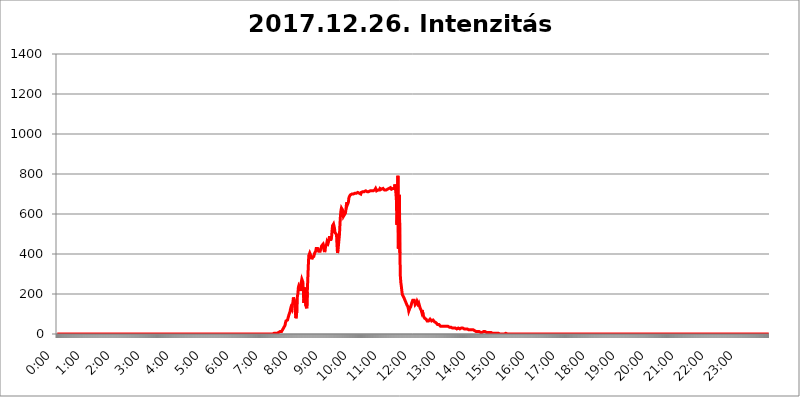
| Category | 2017.12.26. Intenzitás [W/m^2] |
|---|---|
| 0.0 | 0 |
| 0.0006944444444444445 | 0 |
| 0.001388888888888889 | 0 |
| 0.0020833333333333333 | 0 |
| 0.002777777777777778 | 0 |
| 0.003472222222222222 | 0 |
| 0.004166666666666667 | 0 |
| 0.004861111111111111 | 0 |
| 0.005555555555555556 | 0 |
| 0.0062499999999999995 | 0 |
| 0.006944444444444444 | 0 |
| 0.007638888888888889 | 0 |
| 0.008333333333333333 | 0 |
| 0.009027777777777779 | 0 |
| 0.009722222222222222 | 0 |
| 0.010416666666666666 | 0 |
| 0.011111111111111112 | 0 |
| 0.011805555555555555 | 0 |
| 0.012499999999999999 | 0 |
| 0.013194444444444444 | 0 |
| 0.013888888888888888 | 0 |
| 0.014583333333333332 | 0 |
| 0.015277777777777777 | 0 |
| 0.015972222222222224 | 0 |
| 0.016666666666666666 | 0 |
| 0.017361111111111112 | 0 |
| 0.018055555555555557 | 0 |
| 0.01875 | 0 |
| 0.019444444444444445 | 0 |
| 0.02013888888888889 | 0 |
| 0.020833333333333332 | 0 |
| 0.02152777777777778 | 0 |
| 0.022222222222222223 | 0 |
| 0.02291666666666667 | 0 |
| 0.02361111111111111 | 0 |
| 0.024305555555555556 | 0 |
| 0.024999999999999998 | 0 |
| 0.025694444444444447 | 0 |
| 0.02638888888888889 | 0 |
| 0.027083333333333334 | 0 |
| 0.027777777777777776 | 0 |
| 0.02847222222222222 | 0 |
| 0.029166666666666664 | 0 |
| 0.029861111111111113 | 0 |
| 0.030555555555555555 | 0 |
| 0.03125 | 0 |
| 0.03194444444444445 | 0 |
| 0.03263888888888889 | 0 |
| 0.03333333333333333 | 0 |
| 0.034027777777777775 | 0 |
| 0.034722222222222224 | 0 |
| 0.035416666666666666 | 0 |
| 0.036111111111111115 | 0 |
| 0.03680555555555556 | 0 |
| 0.0375 | 0 |
| 0.03819444444444444 | 0 |
| 0.03888888888888889 | 0 |
| 0.03958333333333333 | 0 |
| 0.04027777777777778 | 0 |
| 0.04097222222222222 | 0 |
| 0.041666666666666664 | 0 |
| 0.042361111111111106 | 0 |
| 0.04305555555555556 | 0 |
| 0.043750000000000004 | 0 |
| 0.044444444444444446 | 0 |
| 0.04513888888888889 | 0 |
| 0.04583333333333334 | 0 |
| 0.04652777777777778 | 0 |
| 0.04722222222222222 | 0 |
| 0.04791666666666666 | 0 |
| 0.04861111111111111 | 0 |
| 0.049305555555555554 | 0 |
| 0.049999999999999996 | 0 |
| 0.05069444444444445 | 0 |
| 0.051388888888888894 | 0 |
| 0.052083333333333336 | 0 |
| 0.05277777777777778 | 0 |
| 0.05347222222222222 | 0 |
| 0.05416666666666667 | 0 |
| 0.05486111111111111 | 0 |
| 0.05555555555555555 | 0 |
| 0.05625 | 0 |
| 0.05694444444444444 | 0 |
| 0.057638888888888885 | 0 |
| 0.05833333333333333 | 0 |
| 0.05902777777777778 | 0 |
| 0.059722222222222225 | 0 |
| 0.06041666666666667 | 0 |
| 0.061111111111111116 | 0 |
| 0.06180555555555556 | 0 |
| 0.0625 | 0 |
| 0.06319444444444444 | 0 |
| 0.06388888888888888 | 0 |
| 0.06458333333333334 | 0 |
| 0.06527777777777778 | 0 |
| 0.06597222222222222 | 0 |
| 0.06666666666666667 | 0 |
| 0.06736111111111111 | 0 |
| 0.06805555555555555 | 0 |
| 0.06874999999999999 | 0 |
| 0.06944444444444443 | 0 |
| 0.07013888888888889 | 0 |
| 0.07083333333333333 | 0 |
| 0.07152777777777779 | 0 |
| 0.07222222222222223 | 0 |
| 0.07291666666666667 | 0 |
| 0.07361111111111111 | 0 |
| 0.07430555555555556 | 0 |
| 0.075 | 0 |
| 0.07569444444444444 | 0 |
| 0.0763888888888889 | 0 |
| 0.07708333333333334 | 0 |
| 0.07777777777777778 | 0 |
| 0.07847222222222222 | 0 |
| 0.07916666666666666 | 0 |
| 0.0798611111111111 | 0 |
| 0.08055555555555556 | 0 |
| 0.08125 | 0 |
| 0.08194444444444444 | 0 |
| 0.08263888888888889 | 0 |
| 0.08333333333333333 | 0 |
| 0.08402777777777777 | 0 |
| 0.08472222222222221 | 0 |
| 0.08541666666666665 | 0 |
| 0.08611111111111112 | 0 |
| 0.08680555555555557 | 0 |
| 0.08750000000000001 | 0 |
| 0.08819444444444445 | 0 |
| 0.08888888888888889 | 0 |
| 0.08958333333333333 | 0 |
| 0.09027777777777778 | 0 |
| 0.09097222222222222 | 0 |
| 0.09166666666666667 | 0 |
| 0.09236111111111112 | 0 |
| 0.09305555555555556 | 0 |
| 0.09375 | 0 |
| 0.09444444444444444 | 0 |
| 0.09513888888888888 | 0 |
| 0.09583333333333333 | 0 |
| 0.09652777777777777 | 0 |
| 0.09722222222222222 | 0 |
| 0.09791666666666667 | 0 |
| 0.09861111111111111 | 0 |
| 0.09930555555555555 | 0 |
| 0.09999999999999999 | 0 |
| 0.10069444444444443 | 0 |
| 0.1013888888888889 | 0 |
| 0.10208333333333335 | 0 |
| 0.10277777777777779 | 0 |
| 0.10347222222222223 | 0 |
| 0.10416666666666667 | 0 |
| 0.10486111111111111 | 0 |
| 0.10555555555555556 | 0 |
| 0.10625 | 0 |
| 0.10694444444444444 | 0 |
| 0.1076388888888889 | 0 |
| 0.10833333333333334 | 0 |
| 0.10902777777777778 | 0 |
| 0.10972222222222222 | 0 |
| 0.1111111111111111 | 0 |
| 0.11180555555555556 | 0 |
| 0.11180555555555556 | 0 |
| 0.1125 | 0 |
| 0.11319444444444444 | 0 |
| 0.11388888888888889 | 0 |
| 0.11458333333333333 | 0 |
| 0.11527777777777777 | 0 |
| 0.11597222222222221 | 0 |
| 0.11666666666666665 | 0 |
| 0.1173611111111111 | 0 |
| 0.11805555555555557 | 0 |
| 0.11944444444444445 | 0 |
| 0.12013888888888889 | 0 |
| 0.12083333333333333 | 0 |
| 0.12152777777777778 | 0 |
| 0.12222222222222223 | 0 |
| 0.12291666666666667 | 0 |
| 0.12291666666666667 | 0 |
| 0.12361111111111112 | 0 |
| 0.12430555555555556 | 0 |
| 0.125 | 0 |
| 0.12569444444444444 | 0 |
| 0.12638888888888888 | 0 |
| 0.12708333333333333 | 0 |
| 0.16875 | 0 |
| 0.12847222222222224 | 0 |
| 0.12916666666666668 | 0 |
| 0.12986111111111112 | 0 |
| 0.13055555555555556 | 0 |
| 0.13125 | 0 |
| 0.13194444444444445 | 0 |
| 0.1326388888888889 | 0 |
| 0.13333333333333333 | 0 |
| 0.13402777777777777 | 0 |
| 0.13402777777777777 | 0 |
| 0.13472222222222222 | 0 |
| 0.13541666666666666 | 0 |
| 0.1361111111111111 | 0 |
| 0.13749999999999998 | 0 |
| 0.13819444444444443 | 0 |
| 0.1388888888888889 | 0 |
| 0.13958333333333334 | 0 |
| 0.14027777777777778 | 0 |
| 0.14097222222222222 | 0 |
| 0.14166666666666666 | 0 |
| 0.1423611111111111 | 0 |
| 0.14305555555555557 | 0 |
| 0.14375000000000002 | 0 |
| 0.14444444444444446 | 0 |
| 0.1451388888888889 | 0 |
| 0.1451388888888889 | 0 |
| 0.14652777777777778 | 0 |
| 0.14722222222222223 | 0 |
| 0.14791666666666667 | 0 |
| 0.1486111111111111 | 0 |
| 0.14930555555555555 | 0 |
| 0.15 | 0 |
| 0.15069444444444444 | 0 |
| 0.15138888888888888 | 0 |
| 0.15208333333333332 | 0 |
| 0.15277777777777776 | 0 |
| 0.15347222222222223 | 0 |
| 0.15416666666666667 | 0 |
| 0.15486111111111112 | 0 |
| 0.15555555555555556 | 0 |
| 0.15625 | 0 |
| 0.15694444444444444 | 0 |
| 0.15763888888888888 | 0 |
| 0.15833333333333333 | 0 |
| 0.15902777777777777 | 0 |
| 0.15972222222222224 | 0 |
| 0.16041666666666668 | 0 |
| 0.16111111111111112 | 0 |
| 0.16180555555555556 | 0 |
| 0.1625 | 0 |
| 0.16319444444444445 | 0 |
| 0.1638888888888889 | 0 |
| 0.16458333333333333 | 0 |
| 0.16527777777777777 | 0 |
| 0.16597222222222222 | 0 |
| 0.16666666666666666 | 0 |
| 0.1673611111111111 | 0 |
| 0.16805555555555554 | 0 |
| 0.16874999999999998 | 0 |
| 0.16944444444444443 | 0 |
| 0.17013888888888887 | 0 |
| 0.1708333333333333 | 0 |
| 0.17152777777777775 | 0 |
| 0.17222222222222225 | 0 |
| 0.1729166666666667 | 0 |
| 0.17361111111111113 | 0 |
| 0.17430555555555557 | 0 |
| 0.17500000000000002 | 0 |
| 0.17569444444444446 | 0 |
| 0.1763888888888889 | 0 |
| 0.17708333333333334 | 0 |
| 0.17777777777777778 | 0 |
| 0.17847222222222223 | 0 |
| 0.17916666666666667 | 0 |
| 0.1798611111111111 | 0 |
| 0.18055555555555555 | 0 |
| 0.18125 | 0 |
| 0.18194444444444444 | 0 |
| 0.1826388888888889 | 0 |
| 0.18333333333333335 | 0 |
| 0.1840277777777778 | 0 |
| 0.18472222222222223 | 0 |
| 0.18541666666666667 | 0 |
| 0.18611111111111112 | 0 |
| 0.18680555555555556 | 0 |
| 0.1875 | 0 |
| 0.18819444444444444 | 0 |
| 0.18888888888888888 | 0 |
| 0.18958333333333333 | 0 |
| 0.19027777777777777 | 0 |
| 0.1909722222222222 | 0 |
| 0.19166666666666665 | 0 |
| 0.19236111111111112 | 0 |
| 0.19305555555555554 | 0 |
| 0.19375 | 0 |
| 0.19444444444444445 | 0 |
| 0.1951388888888889 | 0 |
| 0.19583333333333333 | 0 |
| 0.19652777777777777 | 0 |
| 0.19722222222222222 | 0 |
| 0.19791666666666666 | 0 |
| 0.1986111111111111 | 0 |
| 0.19930555555555554 | 0 |
| 0.19999999999999998 | 0 |
| 0.20069444444444443 | 0 |
| 0.20138888888888887 | 0 |
| 0.2020833333333333 | 0 |
| 0.2027777777777778 | 0 |
| 0.2034722222222222 | 0 |
| 0.2041666666666667 | 0 |
| 0.20486111111111113 | 0 |
| 0.20555555555555557 | 0 |
| 0.20625000000000002 | 0 |
| 0.20694444444444446 | 0 |
| 0.2076388888888889 | 0 |
| 0.20833333333333334 | 0 |
| 0.20902777777777778 | 0 |
| 0.20972222222222223 | 0 |
| 0.21041666666666667 | 0 |
| 0.2111111111111111 | 0 |
| 0.21180555555555555 | 0 |
| 0.2125 | 0 |
| 0.21319444444444444 | 0 |
| 0.2138888888888889 | 0 |
| 0.21458333333333335 | 0 |
| 0.2152777777777778 | 0 |
| 0.21597222222222223 | 0 |
| 0.21666666666666667 | 0 |
| 0.21736111111111112 | 0 |
| 0.21805555555555556 | 0 |
| 0.21875 | 0 |
| 0.21944444444444444 | 0 |
| 0.22013888888888888 | 0 |
| 0.22083333333333333 | 0 |
| 0.22152777777777777 | 0 |
| 0.2222222222222222 | 0 |
| 0.22291666666666665 | 0 |
| 0.2236111111111111 | 0 |
| 0.22430555555555556 | 0 |
| 0.225 | 0 |
| 0.22569444444444445 | 0 |
| 0.2263888888888889 | 0 |
| 0.22708333333333333 | 0 |
| 0.22777777777777777 | 0 |
| 0.22847222222222222 | 0 |
| 0.22916666666666666 | 0 |
| 0.2298611111111111 | 0 |
| 0.23055555555555554 | 0 |
| 0.23124999999999998 | 0 |
| 0.23194444444444443 | 0 |
| 0.23263888888888887 | 0 |
| 0.2333333333333333 | 0 |
| 0.2340277777777778 | 0 |
| 0.2347222222222222 | 0 |
| 0.2354166666666667 | 0 |
| 0.23611111111111113 | 0 |
| 0.23680555555555557 | 0 |
| 0.23750000000000002 | 0 |
| 0.23819444444444446 | 0 |
| 0.2388888888888889 | 0 |
| 0.23958333333333334 | 0 |
| 0.24027777777777778 | 0 |
| 0.24097222222222223 | 0 |
| 0.24166666666666667 | 0 |
| 0.2423611111111111 | 0 |
| 0.24305555555555555 | 0 |
| 0.24375 | 0 |
| 0.24444444444444446 | 0 |
| 0.24513888888888888 | 0 |
| 0.24583333333333335 | 0 |
| 0.2465277777777778 | 0 |
| 0.24722222222222223 | 0 |
| 0.24791666666666667 | 0 |
| 0.24861111111111112 | 0 |
| 0.24930555555555556 | 0 |
| 0.25 | 0 |
| 0.25069444444444444 | 0 |
| 0.2513888888888889 | 0 |
| 0.2520833333333333 | 0 |
| 0.25277777777777777 | 0 |
| 0.2534722222222222 | 0 |
| 0.25416666666666665 | 0 |
| 0.2548611111111111 | 0 |
| 0.2555555555555556 | 0 |
| 0.25625000000000003 | 0 |
| 0.2569444444444445 | 0 |
| 0.2576388888888889 | 0 |
| 0.25833333333333336 | 0 |
| 0.2590277777777778 | 0 |
| 0.25972222222222224 | 0 |
| 0.2604166666666667 | 0 |
| 0.2611111111111111 | 0 |
| 0.26180555555555557 | 0 |
| 0.2625 | 0 |
| 0.26319444444444445 | 0 |
| 0.2638888888888889 | 0 |
| 0.26458333333333334 | 0 |
| 0.2652777777777778 | 0 |
| 0.2659722222222222 | 0 |
| 0.26666666666666666 | 0 |
| 0.2673611111111111 | 0 |
| 0.26805555555555555 | 0 |
| 0.26875 | 0 |
| 0.26944444444444443 | 0 |
| 0.2701388888888889 | 0 |
| 0.2708333333333333 | 0 |
| 0.27152777777777776 | 0 |
| 0.2722222222222222 | 0 |
| 0.27291666666666664 | 0 |
| 0.2736111111111111 | 0 |
| 0.2743055555555555 | 0 |
| 0.27499999999999997 | 0 |
| 0.27569444444444446 | 0 |
| 0.27638888888888885 | 0 |
| 0.27708333333333335 | 0 |
| 0.2777777777777778 | 0 |
| 0.27847222222222223 | 0 |
| 0.2791666666666667 | 0 |
| 0.2798611111111111 | 0 |
| 0.28055555555555556 | 0 |
| 0.28125 | 0 |
| 0.28194444444444444 | 0 |
| 0.2826388888888889 | 0 |
| 0.2833333333333333 | 0 |
| 0.28402777777777777 | 0 |
| 0.2847222222222222 | 0 |
| 0.28541666666666665 | 0 |
| 0.28611111111111115 | 0 |
| 0.28680555555555554 | 0 |
| 0.28750000000000003 | 0 |
| 0.2881944444444445 | 0 |
| 0.2888888888888889 | 0 |
| 0.28958333333333336 | 0 |
| 0.2902777777777778 | 0 |
| 0.29097222222222224 | 0 |
| 0.2916666666666667 | 0 |
| 0.2923611111111111 | 0 |
| 0.29305555555555557 | 0 |
| 0.29375 | 0 |
| 0.29444444444444445 | 0 |
| 0.2951388888888889 | 0 |
| 0.29583333333333334 | 0 |
| 0.2965277777777778 | 0 |
| 0.2972222222222222 | 0 |
| 0.29791666666666666 | 0 |
| 0.2986111111111111 | 0 |
| 0.29930555555555555 | 0 |
| 0.3 | 0 |
| 0.30069444444444443 | 0 |
| 0.3013888888888889 | 0 |
| 0.3020833333333333 | 0 |
| 0.30277777777777776 | 0 |
| 0.3034722222222222 | 0 |
| 0.30416666666666664 | 3.525 |
| 0.3048611111111111 | 3.525 |
| 0.3055555555555555 | 3.525 |
| 0.30624999999999997 | 3.525 |
| 0.3069444444444444 | 3.525 |
| 0.3076388888888889 | 3.525 |
| 0.30833333333333335 | 3.525 |
| 0.3090277777777778 | 3.525 |
| 0.30972222222222223 | 7.887 |
| 0.3104166666666667 | 7.887 |
| 0.3111111111111111 | 7.887 |
| 0.31180555555555556 | 7.887 |
| 0.3125 | 12.257 |
| 0.31319444444444444 | 12.257 |
| 0.3138888888888889 | 12.257 |
| 0.3145833333333333 | 12.257 |
| 0.31527777777777777 | 12.257 |
| 0.3159722222222222 | 16.636 |
| 0.31666666666666665 | 25.419 |
| 0.31736111111111115 | 29.823 |
| 0.31805555555555554 | 34.234 |
| 0.31875000000000003 | 38.653 |
| 0.3194444444444445 | 43.079 |
| 0.3201388888888889 | 56.398 |
| 0.32083333333333336 | 65.31 |
| 0.3215277777777778 | 65.31 |
| 0.32222222222222224 | 60.85 |
| 0.3229166666666667 | 69.775 |
| 0.3236111111111111 | 78.722 |
| 0.32430555555555557 | 78.722 |
| 0.325 | 96.682 |
| 0.32569444444444445 | 101.184 |
| 0.3263888888888889 | 110.201 |
| 0.32708333333333334 | 123.758 |
| 0.3277777777777778 | 132.814 |
| 0.3284722222222222 | 137.347 |
| 0.32916666666666666 | 123.758 |
| 0.3298611111111111 | 146.423 |
| 0.33055555555555555 | 160.056 |
| 0.33125 | 182.82 |
| 0.33194444444444443 | 187.378 |
| 0.3326388888888889 | 178.264 |
| 0.3333333333333333 | 155.509 |
| 0.3340277777777778 | 105.69 |
| 0.3347222222222222 | 78.722 |
| 0.3354166666666667 | 83.205 |
| 0.3361111111111111 | 114.716 |
| 0.3368055555555556 | 187.378 |
| 0.33749999999999997 | 201.058 |
| 0.33819444444444446 | 233 |
| 0.33888888888888885 | 242.127 |
| 0.33958333333333335 | 242.127 |
| 0.34027777777777773 | 237.564 |
| 0.34097222222222223 | 228.436 |
| 0.3416666666666666 | 214.746 |
| 0.3423611111111111 | 260.373 |
| 0.3430555555555555 | 274.047 |
| 0.34375 | 278.603 |
| 0.3444444444444445 | 260.373 |
| 0.3451388888888889 | 219.309 |
| 0.3458333333333334 | 155.509 |
| 0.34652777777777777 | 187.378 |
| 0.34722222222222227 | 196.497 |
| 0.34791666666666665 | 233 |
| 0.34861111111111115 | 141.884 |
| 0.34930555555555554 | 137.347 |
| 0.35000000000000003 | 128.284 |
| 0.3506944444444444 | 210.182 |
| 0.3513888888888889 | 274.047 |
| 0.3520833333333333 | 337.639 |
| 0.3527777777777778 | 391.685 |
| 0.3534722222222222 | 396.164 |
| 0.3541666666666667 | 405.108 |
| 0.3548611111111111 | 400.638 |
| 0.35555555555555557 | 405.108 |
| 0.35625 | 387.202 |
| 0.35694444444444445 | 373.729 |
| 0.3576388888888889 | 382.715 |
| 0.35833333333333334 | 382.715 |
| 0.3590277777777778 | 378.224 |
| 0.3597222222222222 | 387.202 |
| 0.36041666666666666 | 382.715 |
| 0.3611111111111111 | 405.108 |
| 0.36180555555555555 | 400.638 |
| 0.3625 | 414.035 |
| 0.36319444444444443 | 427.39 |
| 0.3638888888888889 | 422.943 |
| 0.3645833333333333 | 431.833 |
| 0.3652777777777778 | 427.39 |
| 0.3659722222222222 | 422.943 |
| 0.3666666666666667 | 414.035 |
| 0.3673611111111111 | 409.574 |
| 0.3680555555555556 | 414.035 |
| 0.36874999999999997 | 414.035 |
| 0.36944444444444446 | 414.035 |
| 0.37013888888888885 | 431.833 |
| 0.37083333333333335 | 440.702 |
| 0.37152777777777773 | 436.27 |
| 0.37222222222222223 | 436.27 |
| 0.3729166666666666 | 449.551 |
| 0.3736111111111111 | 440.702 |
| 0.3743055555555555 | 418.492 |
| 0.375 | 409.574 |
| 0.3756944444444445 | 422.943 |
| 0.3763888888888889 | 436.27 |
| 0.3770833333333334 | 440.702 |
| 0.37777777777777777 | 449.551 |
| 0.37847222222222227 | 462.786 |
| 0.37916666666666665 | 458.38 |
| 0.37986111111111115 | 453.968 |
| 0.38055555555555554 | 462.786 |
| 0.38125000000000003 | 467.187 |
| 0.3819444444444444 | 489.108 |
| 0.3826388888888889 | 484.735 |
| 0.3833333333333333 | 467.187 |
| 0.3840277777777778 | 467.187 |
| 0.3847222222222222 | 484.735 |
| 0.3854166666666667 | 515.223 |
| 0.3861111111111111 | 541.121 |
| 0.38680555555555557 | 541.121 |
| 0.3875 | 549.704 |
| 0.38819444444444445 | 545.416 |
| 0.3888888888888889 | 528.2 |
| 0.38958333333333334 | 506.542 |
| 0.3902777777777778 | 510.885 |
| 0.3909722222222222 | 506.542 |
| 0.39166666666666666 | 497.836 |
| 0.3923611111111111 | 445.129 |
| 0.39305555555555555 | 405.108 |
| 0.39375 | 418.492 |
| 0.39444444444444443 | 445.129 |
| 0.3951388888888889 | 471.582 |
| 0.3958333333333333 | 497.836 |
| 0.3965277777777778 | 549.704 |
| 0.3972222222222222 | 592.233 |
| 0.3979166666666667 | 617.436 |
| 0.3986111111111111 | 629.948 |
| 0.3993055555555556 | 634.105 |
| 0.39999999999999997 | 621.613 |
| 0.40069444444444446 | 609.062 |
| 0.40138888888888885 | 588.009 |
| 0.40208333333333335 | 592.233 |
| 0.40277777777777773 | 596.45 |
| 0.40347222222222223 | 596.45 |
| 0.4041666666666666 | 604.864 |
| 0.4048611111111111 | 621.613 |
| 0.4055555555555555 | 646.537 |
| 0.40625 | 658.909 |
| 0.4069444444444445 | 646.537 |
| 0.4076388888888889 | 646.537 |
| 0.4083333333333334 | 658.909 |
| 0.40902777777777777 | 679.395 |
| 0.40972222222222227 | 687.544 |
| 0.41041666666666665 | 691.608 |
| 0.41111111111111115 | 695.666 |
| 0.41180555555555554 | 695.666 |
| 0.41250000000000003 | 695.666 |
| 0.4131944444444444 | 699.717 |
| 0.4138888888888889 | 699.717 |
| 0.4145833333333333 | 699.717 |
| 0.4152777777777778 | 699.717 |
| 0.4159722222222222 | 703.762 |
| 0.4166666666666667 | 703.762 |
| 0.4173611111111111 | 703.762 |
| 0.41805555555555557 | 703.762 |
| 0.41875 | 699.717 |
| 0.41944444444444445 | 703.762 |
| 0.4201388888888889 | 703.762 |
| 0.42083333333333334 | 707.8 |
| 0.4215277777777778 | 707.8 |
| 0.4222222222222222 | 707.8 |
| 0.42291666666666666 | 703.762 |
| 0.4236111111111111 | 703.762 |
| 0.42430555555555555 | 703.762 |
| 0.425 | 703.762 |
| 0.42569444444444443 | 699.717 |
| 0.4263888888888889 | 707.8 |
| 0.4270833333333333 | 707.8 |
| 0.4277777777777778 | 711.832 |
| 0.4284722222222222 | 711.832 |
| 0.4291666666666667 | 711.832 |
| 0.4298611111111111 | 711.832 |
| 0.4305555555555556 | 711.832 |
| 0.43124999999999997 | 715.858 |
| 0.43194444444444446 | 711.832 |
| 0.43263888888888885 | 715.858 |
| 0.43333333333333335 | 715.858 |
| 0.43402777777777773 | 711.832 |
| 0.43472222222222223 | 711.832 |
| 0.4354166666666666 | 715.858 |
| 0.4361111111111111 | 711.832 |
| 0.4368055555555555 | 711.832 |
| 0.4375 | 715.858 |
| 0.4381944444444445 | 715.858 |
| 0.4388888888888889 | 715.858 |
| 0.4395833333333334 | 715.858 |
| 0.44027777777777777 | 715.858 |
| 0.44097222222222227 | 715.858 |
| 0.44166666666666665 | 719.877 |
| 0.44236111111111115 | 719.877 |
| 0.44305555555555554 | 715.858 |
| 0.44375000000000003 | 715.858 |
| 0.4444444444444444 | 711.832 |
| 0.4451388888888889 | 719.877 |
| 0.4458333333333333 | 719.877 |
| 0.4465277777777778 | 727.896 |
| 0.4472222222222222 | 727.896 |
| 0.4479166666666667 | 715.858 |
| 0.4486111111111111 | 715.858 |
| 0.44930555555555557 | 719.877 |
| 0.45 | 719.877 |
| 0.45069444444444445 | 719.877 |
| 0.4513888888888889 | 723.889 |
| 0.45208333333333334 | 719.877 |
| 0.4527777777777778 | 727.896 |
| 0.4534722222222222 | 727.896 |
| 0.45416666666666666 | 727.896 |
| 0.4548611111111111 | 723.889 |
| 0.45555555555555555 | 723.889 |
| 0.45625 | 727.896 |
| 0.45694444444444443 | 727.896 |
| 0.4576388888888889 | 727.896 |
| 0.4583333333333333 | 727.896 |
| 0.4590277777777778 | 719.877 |
| 0.4597222222222222 | 715.858 |
| 0.4604166666666667 | 719.877 |
| 0.4611111111111111 | 719.877 |
| 0.4618055555555556 | 719.877 |
| 0.46249999999999997 | 723.889 |
| 0.46319444444444446 | 723.889 |
| 0.46388888888888885 | 723.889 |
| 0.46458333333333335 | 719.877 |
| 0.46527777777777773 | 727.896 |
| 0.46597222222222223 | 723.889 |
| 0.4666666666666666 | 723.889 |
| 0.4673611111111111 | 731.896 |
| 0.4680555555555555 | 727.896 |
| 0.46875 | 723.889 |
| 0.4694444444444445 | 719.877 |
| 0.4701388888888889 | 727.896 |
| 0.4708333333333334 | 727.896 |
| 0.47152777777777777 | 727.896 |
| 0.47222222222222227 | 723.889 |
| 0.47291666666666665 | 727.896 |
| 0.47361111111111115 | 747.834 |
| 0.47430555555555554 | 727.896 |
| 0.47500000000000003 | 703.762 |
| 0.4756944444444444 | 667.123 |
| 0.4763888888888889 | 545.416 |
| 0.4770833333333333 | 600.661 |
| 0.4777777777777778 | 791.169 |
| 0.4784722222222222 | 427.39 |
| 0.4791666666666667 | 609.062 |
| 0.4798611111111111 | 695.666 |
| 0.48055555555555557 | 405.108 |
| 0.48125 | 287.709 |
| 0.48194444444444445 | 255.813 |
| 0.4826388888888889 | 237.564 |
| 0.48333333333333334 | 214.746 |
| 0.4840277777777778 | 196.497 |
| 0.4847222222222222 | 196.497 |
| 0.48541666666666666 | 191.937 |
| 0.4861111111111111 | 182.82 |
| 0.48680555555555555 | 178.264 |
| 0.4875 | 182.82 |
| 0.48819444444444443 | 164.605 |
| 0.4888888888888889 | 164.605 |
| 0.4895833333333333 | 160.056 |
| 0.4902777777777778 | 146.423 |
| 0.4909722222222222 | 141.884 |
| 0.4916666666666667 | 137.347 |
| 0.4923611111111111 | 128.284 |
| 0.4930555555555556 | 114.716 |
| 0.49374999999999997 | 119.235 |
| 0.49444444444444446 | 128.284 |
| 0.49513888888888885 | 128.284 |
| 0.49583333333333335 | 137.347 |
| 0.49652777777777773 | 146.423 |
| 0.49722222222222223 | 155.509 |
| 0.4979166666666666 | 160.056 |
| 0.4986111111111111 | 169.156 |
| 0.4993055555555555 | 169.156 |
| 0.5 | 169.156 |
| 0.5006944444444444 | 169.156 |
| 0.5013888888888889 | 160.056 |
| 0.5020833333333333 | 146.423 |
| 0.5027777777777778 | 141.884 |
| 0.5034722222222222 | 141.884 |
| 0.5041666666666667 | 155.509 |
| 0.5048611111111111 | 164.605 |
| 0.5055555555555555 | 169.156 |
| 0.50625 | 155.509 |
| 0.5069444444444444 | 137.347 |
| 0.5076388888888889 | 146.423 |
| 0.5083333333333333 | 137.347 |
| 0.5090277777777777 | 128.284 |
| 0.5097222222222222 | 128.284 |
| 0.5104166666666666 | 119.235 |
| 0.5111111111111112 | 110.201 |
| 0.5118055555555555 | 119.235 |
| 0.5125000000000001 | 114.716 |
| 0.5131944444444444 | 96.682 |
| 0.513888888888889 | 87.692 |
| 0.5145833333333333 | 83.205 |
| 0.5152777777777778 | 78.722 |
| 0.5159722222222222 | 83.205 |
| 0.5166666666666667 | 83.205 |
| 0.517361111111111 | 74.246 |
| 0.5180555555555556 | 69.775 |
| 0.5187499999999999 | 65.31 |
| 0.5194444444444445 | 65.31 |
| 0.5201388888888888 | 65.31 |
| 0.5208333333333334 | 65.31 |
| 0.5215277777777778 | 65.31 |
| 0.5222222222222223 | 69.775 |
| 0.5229166666666667 | 74.246 |
| 0.5236111111111111 | 74.246 |
| 0.5243055555555556 | 74.246 |
| 0.525 | 65.31 |
| 0.5256944444444445 | 65.31 |
| 0.5263888888888889 | 69.775 |
| 0.5270833333333333 | 69.775 |
| 0.5277777777777778 | 69.775 |
| 0.5284722222222222 | 65.31 |
| 0.5291666666666667 | 60.85 |
| 0.5298611111111111 | 56.398 |
| 0.5305555555555556 | 56.398 |
| 0.53125 | 56.398 |
| 0.5319444444444444 | 51.951 |
| 0.5326388888888889 | 51.951 |
| 0.5333333333333333 | 47.511 |
| 0.5340277777777778 | 47.511 |
| 0.5347222222222222 | 47.511 |
| 0.5354166666666667 | 47.511 |
| 0.5361111111111111 | 43.079 |
| 0.5368055555555555 | 43.079 |
| 0.5375 | 38.653 |
| 0.5381944444444444 | 43.079 |
| 0.5388888888888889 | 38.653 |
| 0.5395833333333333 | 38.653 |
| 0.5402777777777777 | 43.079 |
| 0.5409722222222222 | 38.653 |
| 0.5416666666666666 | 38.653 |
| 0.5423611111111112 | 38.653 |
| 0.5430555555555555 | 38.653 |
| 0.5437500000000001 | 38.653 |
| 0.5444444444444444 | 38.653 |
| 0.545138888888889 | 38.653 |
| 0.5458333333333333 | 38.653 |
| 0.5465277777777778 | 38.653 |
| 0.5472222222222222 | 38.653 |
| 0.5479166666666667 | 38.653 |
| 0.548611111111111 | 34.234 |
| 0.5493055555555556 | 34.234 |
| 0.5499999999999999 | 34.234 |
| 0.5506944444444445 | 34.234 |
| 0.5513888888888888 | 34.234 |
| 0.5520833333333334 | 34.234 |
| 0.5527777777777778 | 29.823 |
| 0.5534722222222223 | 29.823 |
| 0.5541666666666667 | 29.823 |
| 0.5548611111111111 | 29.823 |
| 0.5555555555555556 | 29.823 |
| 0.55625 | 29.823 |
| 0.5569444444444445 | 29.823 |
| 0.5576388888888889 | 25.419 |
| 0.5583333333333333 | 29.823 |
| 0.5590277777777778 | 25.419 |
| 0.5597222222222222 | 25.419 |
| 0.5604166666666667 | 25.419 |
| 0.5611111111111111 | 29.823 |
| 0.5618055555555556 | 29.823 |
| 0.5625 | 29.823 |
| 0.5631944444444444 | 25.419 |
| 0.5638888888888889 | 25.419 |
| 0.5645833333333333 | 25.419 |
| 0.5652777777777778 | 25.419 |
| 0.5659722222222222 | 25.419 |
| 0.5666666666666667 | 29.823 |
| 0.5673611111111111 | 29.823 |
| 0.5680555555555555 | 29.823 |
| 0.56875 | 29.823 |
| 0.5694444444444444 | 25.419 |
| 0.5701388888888889 | 29.823 |
| 0.5708333333333333 | 25.419 |
| 0.5715277777777777 | 25.419 |
| 0.5722222222222222 | 25.419 |
| 0.5729166666666666 | 25.419 |
| 0.5736111111111112 | 25.419 |
| 0.5743055555555555 | 25.419 |
| 0.5750000000000001 | 25.419 |
| 0.5756944444444444 | 21.024 |
| 0.576388888888889 | 21.024 |
| 0.5770833333333333 | 21.024 |
| 0.5777777777777778 | 21.024 |
| 0.5784722222222222 | 21.024 |
| 0.5791666666666667 | 21.024 |
| 0.579861111111111 | 21.024 |
| 0.5805555555555556 | 21.024 |
| 0.5812499999999999 | 21.024 |
| 0.5819444444444445 | 21.024 |
| 0.5826388888888888 | 21.024 |
| 0.5833333333333334 | 21.024 |
| 0.5840277777777778 | 21.024 |
| 0.5847222222222223 | 16.636 |
| 0.5854166666666667 | 16.636 |
| 0.5861111111111111 | 16.636 |
| 0.5868055555555556 | 12.257 |
| 0.5875 | 12.257 |
| 0.5881944444444445 | 12.257 |
| 0.5888888888888889 | 12.257 |
| 0.5895833333333333 | 12.257 |
| 0.5902777777777778 | 12.257 |
| 0.5909722222222222 | 12.257 |
| 0.5916666666666667 | 12.257 |
| 0.5923611111111111 | 12.257 |
| 0.5930555555555556 | 12.257 |
| 0.59375 | 7.887 |
| 0.5944444444444444 | 7.887 |
| 0.5951388888888889 | 7.887 |
| 0.5958333333333333 | 7.887 |
| 0.5965277777777778 | 7.887 |
| 0.5972222222222222 | 12.257 |
| 0.5979166666666667 | 12.257 |
| 0.5986111111111111 | 12.257 |
| 0.5993055555555555 | 12.257 |
| 0.6 | 12.257 |
| 0.6006944444444444 | 12.257 |
| 0.6013888888888889 | 7.887 |
| 0.6020833333333333 | 7.887 |
| 0.6027777777777777 | 7.887 |
| 0.6034722222222222 | 7.887 |
| 0.6041666666666666 | 7.887 |
| 0.6048611111111112 | 7.887 |
| 0.6055555555555555 | 7.887 |
| 0.6062500000000001 | 7.887 |
| 0.6069444444444444 | 7.887 |
| 0.607638888888889 | 7.887 |
| 0.6083333333333333 | 7.887 |
| 0.6090277777777778 | 7.887 |
| 0.6097222222222222 | 7.887 |
| 0.6104166666666667 | 3.525 |
| 0.611111111111111 | 3.525 |
| 0.6118055555555556 | 3.525 |
| 0.6124999999999999 | 3.525 |
| 0.6131944444444445 | 3.525 |
| 0.6138888888888888 | 3.525 |
| 0.6145833333333334 | 3.525 |
| 0.6152777777777778 | 7.887 |
| 0.6159722222222223 | 7.887 |
| 0.6166666666666667 | 3.525 |
| 0.6173611111111111 | 3.525 |
| 0.6180555555555556 | 3.525 |
| 0.61875 | 3.525 |
| 0.6194444444444445 | 3.525 |
| 0.6201388888888889 | 3.525 |
| 0.6208333333333333 | 0 |
| 0.6215277777777778 | 0 |
| 0.6222222222222222 | 0 |
| 0.6229166666666667 | 0 |
| 0.6236111111111111 | 0 |
| 0.6243055555555556 | 0 |
| 0.625 | 0 |
| 0.6256944444444444 | 0 |
| 0.6263888888888889 | 0 |
| 0.6270833333333333 | 0 |
| 0.6277777777777778 | 0 |
| 0.6284722222222222 | 3.525 |
| 0.6291666666666667 | 3.525 |
| 0.6298611111111111 | 3.525 |
| 0.6305555555555555 | 0 |
| 0.63125 | 0 |
| 0.6319444444444444 | 0 |
| 0.6326388888888889 | 0 |
| 0.6333333333333333 | 0 |
| 0.6340277777777777 | 0 |
| 0.6347222222222222 | 0 |
| 0.6354166666666666 | 0 |
| 0.6361111111111112 | 0 |
| 0.6368055555555555 | 0 |
| 0.6375000000000001 | 0 |
| 0.6381944444444444 | 0 |
| 0.638888888888889 | 0 |
| 0.6395833333333333 | 0 |
| 0.6402777777777778 | 0 |
| 0.6409722222222222 | 0 |
| 0.6416666666666667 | 0 |
| 0.642361111111111 | 0 |
| 0.6430555555555556 | 0 |
| 0.6437499999999999 | 0 |
| 0.6444444444444445 | 0 |
| 0.6451388888888888 | 0 |
| 0.6458333333333334 | 0 |
| 0.6465277777777778 | 0 |
| 0.6472222222222223 | 0 |
| 0.6479166666666667 | 0 |
| 0.6486111111111111 | 0 |
| 0.6493055555555556 | 0 |
| 0.65 | 0 |
| 0.6506944444444445 | 0 |
| 0.6513888888888889 | 0 |
| 0.6520833333333333 | 0 |
| 0.6527777777777778 | 0 |
| 0.6534722222222222 | 0 |
| 0.6541666666666667 | 0 |
| 0.6548611111111111 | 0 |
| 0.6555555555555556 | 0 |
| 0.65625 | 0 |
| 0.6569444444444444 | 0 |
| 0.6576388888888889 | 0 |
| 0.6583333333333333 | 0 |
| 0.6590277777777778 | 0 |
| 0.6597222222222222 | 0 |
| 0.6604166666666667 | 0 |
| 0.6611111111111111 | 0 |
| 0.6618055555555555 | 0 |
| 0.6625 | 0 |
| 0.6631944444444444 | 0 |
| 0.6638888888888889 | 0 |
| 0.6645833333333333 | 0 |
| 0.6652777777777777 | 0 |
| 0.6659722222222222 | 0 |
| 0.6666666666666666 | 0 |
| 0.6673611111111111 | 0 |
| 0.6680555555555556 | 0 |
| 0.6687500000000001 | 0 |
| 0.6694444444444444 | 0 |
| 0.6701388888888888 | 0 |
| 0.6708333333333334 | 0 |
| 0.6715277777777778 | 0 |
| 0.6722222222222222 | 0 |
| 0.6729166666666666 | 0 |
| 0.6736111111111112 | 0 |
| 0.6743055555555556 | 0 |
| 0.6749999999999999 | 0 |
| 0.6756944444444444 | 0 |
| 0.6763888888888889 | 0 |
| 0.6770833333333334 | 0 |
| 0.6777777777777777 | 0 |
| 0.6784722222222223 | 0 |
| 0.6791666666666667 | 0 |
| 0.6798611111111111 | 0 |
| 0.6805555555555555 | 0 |
| 0.68125 | 0 |
| 0.6819444444444445 | 0 |
| 0.6826388888888889 | 0 |
| 0.6833333333333332 | 0 |
| 0.6840277777777778 | 0 |
| 0.6847222222222222 | 0 |
| 0.6854166666666667 | 0 |
| 0.686111111111111 | 0 |
| 0.6868055555555556 | 0 |
| 0.6875 | 0 |
| 0.6881944444444444 | 0 |
| 0.688888888888889 | 0 |
| 0.6895833333333333 | 0 |
| 0.6902777777777778 | 0 |
| 0.6909722222222222 | 0 |
| 0.6916666666666668 | 0 |
| 0.6923611111111111 | 0 |
| 0.6930555555555555 | 0 |
| 0.69375 | 0 |
| 0.6944444444444445 | 0 |
| 0.6951388888888889 | 0 |
| 0.6958333333333333 | 0 |
| 0.6965277777777777 | 0 |
| 0.6972222222222223 | 0 |
| 0.6979166666666666 | 0 |
| 0.6986111111111111 | 0 |
| 0.6993055555555556 | 0 |
| 0.7000000000000001 | 0 |
| 0.7006944444444444 | 0 |
| 0.7013888888888888 | 0 |
| 0.7020833333333334 | 0 |
| 0.7027777777777778 | 0 |
| 0.7034722222222222 | 0 |
| 0.7041666666666666 | 0 |
| 0.7048611111111112 | 0 |
| 0.7055555555555556 | 0 |
| 0.7062499999999999 | 0 |
| 0.7069444444444444 | 0 |
| 0.7076388888888889 | 0 |
| 0.7083333333333334 | 0 |
| 0.7090277777777777 | 0 |
| 0.7097222222222223 | 0 |
| 0.7104166666666667 | 0 |
| 0.7111111111111111 | 0 |
| 0.7118055555555555 | 0 |
| 0.7125 | 0 |
| 0.7131944444444445 | 0 |
| 0.7138888888888889 | 0 |
| 0.7145833333333332 | 0 |
| 0.7152777777777778 | 0 |
| 0.7159722222222222 | 0 |
| 0.7166666666666667 | 0 |
| 0.717361111111111 | 0 |
| 0.7180555555555556 | 0 |
| 0.71875 | 0 |
| 0.7194444444444444 | 0 |
| 0.720138888888889 | 0 |
| 0.7208333333333333 | 0 |
| 0.7215277777777778 | 0 |
| 0.7222222222222222 | 0 |
| 0.7229166666666668 | 0 |
| 0.7236111111111111 | 0 |
| 0.7243055555555555 | 0 |
| 0.725 | 0 |
| 0.7256944444444445 | 0 |
| 0.7263888888888889 | 0 |
| 0.7270833333333333 | 0 |
| 0.7277777777777777 | 0 |
| 0.7284722222222223 | 0 |
| 0.7291666666666666 | 0 |
| 0.7298611111111111 | 0 |
| 0.7305555555555556 | 0 |
| 0.7312500000000001 | 0 |
| 0.7319444444444444 | 0 |
| 0.7326388888888888 | 0 |
| 0.7333333333333334 | 0 |
| 0.7340277777777778 | 0 |
| 0.7347222222222222 | 0 |
| 0.7354166666666666 | 0 |
| 0.7361111111111112 | 0 |
| 0.7368055555555556 | 0 |
| 0.7374999999999999 | 0 |
| 0.7381944444444444 | 0 |
| 0.7388888888888889 | 0 |
| 0.7395833333333334 | 0 |
| 0.7402777777777777 | 0 |
| 0.7409722222222223 | 0 |
| 0.7416666666666667 | 0 |
| 0.7423611111111111 | 0 |
| 0.7430555555555555 | 0 |
| 0.74375 | 0 |
| 0.7444444444444445 | 0 |
| 0.7451388888888889 | 0 |
| 0.7458333333333332 | 0 |
| 0.7465277777777778 | 0 |
| 0.7472222222222222 | 0 |
| 0.7479166666666667 | 0 |
| 0.748611111111111 | 0 |
| 0.7493055555555556 | 0 |
| 0.75 | 0 |
| 0.7506944444444444 | 0 |
| 0.751388888888889 | 0 |
| 0.7520833333333333 | 0 |
| 0.7527777777777778 | 0 |
| 0.7534722222222222 | 0 |
| 0.7541666666666668 | 0 |
| 0.7548611111111111 | 0 |
| 0.7555555555555555 | 0 |
| 0.75625 | 0 |
| 0.7569444444444445 | 0 |
| 0.7576388888888889 | 0 |
| 0.7583333333333333 | 0 |
| 0.7590277777777777 | 0 |
| 0.7597222222222223 | 0 |
| 0.7604166666666666 | 0 |
| 0.7611111111111111 | 0 |
| 0.7618055555555556 | 0 |
| 0.7625000000000001 | 0 |
| 0.7631944444444444 | 0 |
| 0.7638888888888888 | 0 |
| 0.7645833333333334 | 0 |
| 0.7652777777777778 | 0 |
| 0.7659722222222222 | 0 |
| 0.7666666666666666 | 0 |
| 0.7673611111111112 | 0 |
| 0.7680555555555556 | 0 |
| 0.7687499999999999 | 0 |
| 0.7694444444444444 | 0 |
| 0.7701388888888889 | 0 |
| 0.7708333333333334 | 0 |
| 0.7715277777777777 | 0 |
| 0.7722222222222223 | 0 |
| 0.7729166666666667 | 0 |
| 0.7736111111111111 | 0 |
| 0.7743055555555555 | 0 |
| 0.775 | 0 |
| 0.7756944444444445 | 0 |
| 0.7763888888888889 | 0 |
| 0.7770833333333332 | 0 |
| 0.7777777777777778 | 0 |
| 0.7784722222222222 | 0 |
| 0.7791666666666667 | 0 |
| 0.779861111111111 | 0 |
| 0.7805555555555556 | 0 |
| 0.78125 | 0 |
| 0.7819444444444444 | 0 |
| 0.782638888888889 | 0 |
| 0.7833333333333333 | 0 |
| 0.7840277777777778 | 0 |
| 0.7847222222222222 | 0 |
| 0.7854166666666668 | 0 |
| 0.7861111111111111 | 0 |
| 0.7868055555555555 | 0 |
| 0.7875 | 0 |
| 0.7881944444444445 | 0 |
| 0.7888888888888889 | 0 |
| 0.7895833333333333 | 0 |
| 0.7902777777777777 | 0 |
| 0.7909722222222223 | 0 |
| 0.7916666666666666 | 0 |
| 0.7923611111111111 | 0 |
| 0.7930555555555556 | 0 |
| 0.7937500000000001 | 0 |
| 0.7944444444444444 | 0 |
| 0.7951388888888888 | 0 |
| 0.7958333333333334 | 0 |
| 0.7965277777777778 | 0 |
| 0.7972222222222222 | 0 |
| 0.7979166666666666 | 0 |
| 0.7986111111111112 | 0 |
| 0.7993055555555556 | 0 |
| 0.7999999999999999 | 0 |
| 0.8006944444444444 | 0 |
| 0.8013888888888889 | 0 |
| 0.8020833333333334 | 0 |
| 0.8027777777777777 | 0 |
| 0.8034722222222223 | 0 |
| 0.8041666666666667 | 0 |
| 0.8048611111111111 | 0 |
| 0.8055555555555555 | 0 |
| 0.80625 | 0 |
| 0.8069444444444445 | 0 |
| 0.8076388888888889 | 0 |
| 0.8083333333333332 | 0 |
| 0.8090277777777778 | 0 |
| 0.8097222222222222 | 0 |
| 0.8104166666666667 | 0 |
| 0.811111111111111 | 0 |
| 0.8118055555555556 | 0 |
| 0.8125 | 0 |
| 0.8131944444444444 | 0 |
| 0.813888888888889 | 0 |
| 0.8145833333333333 | 0 |
| 0.8152777777777778 | 0 |
| 0.8159722222222222 | 0 |
| 0.8166666666666668 | 0 |
| 0.8173611111111111 | 0 |
| 0.8180555555555555 | 0 |
| 0.81875 | 0 |
| 0.8194444444444445 | 0 |
| 0.8201388888888889 | 0 |
| 0.8208333333333333 | 0 |
| 0.8215277777777777 | 0 |
| 0.8222222222222223 | 0 |
| 0.8229166666666666 | 0 |
| 0.8236111111111111 | 0 |
| 0.8243055555555556 | 0 |
| 0.8250000000000001 | 0 |
| 0.8256944444444444 | 0 |
| 0.8263888888888888 | 0 |
| 0.8270833333333334 | 0 |
| 0.8277777777777778 | 0 |
| 0.8284722222222222 | 0 |
| 0.8291666666666666 | 0 |
| 0.8298611111111112 | 0 |
| 0.8305555555555556 | 0 |
| 0.8312499999999999 | 0 |
| 0.8319444444444444 | 0 |
| 0.8326388888888889 | 0 |
| 0.8333333333333334 | 0 |
| 0.8340277777777777 | 0 |
| 0.8347222222222223 | 0 |
| 0.8354166666666667 | 0 |
| 0.8361111111111111 | 0 |
| 0.8368055555555555 | 0 |
| 0.8375 | 0 |
| 0.8381944444444445 | 0 |
| 0.8388888888888889 | 0 |
| 0.8395833333333332 | 0 |
| 0.8402777777777778 | 0 |
| 0.8409722222222222 | 0 |
| 0.8416666666666667 | 0 |
| 0.842361111111111 | 0 |
| 0.8430555555555556 | 0 |
| 0.84375 | 0 |
| 0.8444444444444444 | 0 |
| 0.845138888888889 | 0 |
| 0.8458333333333333 | 0 |
| 0.8465277777777778 | 0 |
| 0.8472222222222222 | 0 |
| 0.8479166666666668 | 0 |
| 0.8486111111111111 | 0 |
| 0.8493055555555555 | 0 |
| 0.85 | 0 |
| 0.8506944444444445 | 0 |
| 0.8513888888888889 | 0 |
| 0.8520833333333333 | 0 |
| 0.8527777777777777 | 0 |
| 0.8534722222222223 | 0 |
| 0.8541666666666666 | 0 |
| 0.8548611111111111 | 0 |
| 0.8555555555555556 | 0 |
| 0.8562500000000001 | 0 |
| 0.8569444444444444 | 0 |
| 0.8576388888888888 | 0 |
| 0.8583333333333334 | 0 |
| 0.8590277777777778 | 0 |
| 0.8597222222222222 | 0 |
| 0.8604166666666666 | 0 |
| 0.8611111111111112 | 0 |
| 0.8618055555555556 | 0 |
| 0.8624999999999999 | 0 |
| 0.8631944444444444 | 0 |
| 0.8638888888888889 | 0 |
| 0.8645833333333334 | 0 |
| 0.8652777777777777 | 0 |
| 0.8659722222222223 | 0 |
| 0.8666666666666667 | 0 |
| 0.8673611111111111 | 0 |
| 0.8680555555555555 | 0 |
| 0.86875 | 0 |
| 0.8694444444444445 | 0 |
| 0.8701388888888889 | 0 |
| 0.8708333333333332 | 0 |
| 0.8715277777777778 | 0 |
| 0.8722222222222222 | 0 |
| 0.8729166666666667 | 0 |
| 0.873611111111111 | 0 |
| 0.8743055555555556 | 0 |
| 0.875 | 0 |
| 0.8756944444444444 | 0 |
| 0.876388888888889 | 0 |
| 0.8770833333333333 | 0 |
| 0.8777777777777778 | 0 |
| 0.8784722222222222 | 0 |
| 0.8791666666666668 | 0 |
| 0.8798611111111111 | 0 |
| 0.8805555555555555 | 0 |
| 0.88125 | 0 |
| 0.8819444444444445 | 0 |
| 0.8826388888888889 | 0 |
| 0.8833333333333333 | 0 |
| 0.8840277777777777 | 0 |
| 0.8847222222222223 | 0 |
| 0.8854166666666666 | 0 |
| 0.8861111111111111 | 0 |
| 0.8868055555555556 | 0 |
| 0.8875000000000001 | 0 |
| 0.8881944444444444 | 0 |
| 0.8888888888888888 | 0 |
| 0.8895833333333334 | 0 |
| 0.8902777777777778 | 0 |
| 0.8909722222222222 | 0 |
| 0.8916666666666666 | 0 |
| 0.8923611111111112 | 0 |
| 0.8930555555555556 | 0 |
| 0.8937499999999999 | 0 |
| 0.8944444444444444 | 0 |
| 0.8951388888888889 | 0 |
| 0.8958333333333334 | 0 |
| 0.8965277777777777 | 0 |
| 0.8972222222222223 | 0 |
| 0.8979166666666667 | 0 |
| 0.8986111111111111 | 0 |
| 0.8993055555555555 | 0 |
| 0.9 | 0 |
| 0.9006944444444445 | 0 |
| 0.9013888888888889 | 0 |
| 0.9020833333333332 | 0 |
| 0.9027777777777778 | 0 |
| 0.9034722222222222 | 0 |
| 0.9041666666666667 | 0 |
| 0.904861111111111 | 0 |
| 0.9055555555555556 | 0 |
| 0.90625 | 0 |
| 0.9069444444444444 | 0 |
| 0.907638888888889 | 0 |
| 0.9083333333333333 | 0 |
| 0.9090277777777778 | 0 |
| 0.9097222222222222 | 0 |
| 0.9104166666666668 | 0 |
| 0.9111111111111111 | 0 |
| 0.9118055555555555 | 0 |
| 0.9125 | 0 |
| 0.9131944444444445 | 0 |
| 0.9138888888888889 | 0 |
| 0.9145833333333333 | 0 |
| 0.9152777777777777 | 0 |
| 0.9159722222222223 | 0 |
| 0.9166666666666666 | 0 |
| 0.9173611111111111 | 0 |
| 0.9180555555555556 | 0 |
| 0.9187500000000001 | 0 |
| 0.9194444444444444 | 0 |
| 0.9201388888888888 | 0 |
| 0.9208333333333334 | 0 |
| 0.9215277777777778 | 0 |
| 0.9222222222222222 | 0 |
| 0.9229166666666666 | 0 |
| 0.9236111111111112 | 0 |
| 0.9243055555555556 | 0 |
| 0.9249999999999999 | 0 |
| 0.9256944444444444 | 0 |
| 0.9263888888888889 | 0 |
| 0.9270833333333334 | 0 |
| 0.9277777777777777 | 0 |
| 0.9284722222222223 | 0 |
| 0.9291666666666667 | 0 |
| 0.9298611111111111 | 0 |
| 0.9305555555555555 | 0 |
| 0.93125 | 0 |
| 0.9319444444444445 | 0 |
| 0.9326388888888889 | 0 |
| 0.9333333333333332 | 0 |
| 0.9340277777777778 | 0 |
| 0.9347222222222222 | 0 |
| 0.9354166666666667 | 0 |
| 0.936111111111111 | 0 |
| 0.9368055555555556 | 0 |
| 0.9375 | 0 |
| 0.9381944444444444 | 0 |
| 0.938888888888889 | 0 |
| 0.9395833333333333 | 0 |
| 0.9402777777777778 | 0 |
| 0.9409722222222222 | 0 |
| 0.9416666666666668 | 0 |
| 0.9423611111111111 | 0 |
| 0.9430555555555555 | 0 |
| 0.94375 | 0 |
| 0.9444444444444445 | 0 |
| 0.9451388888888889 | 0 |
| 0.9458333333333333 | 0 |
| 0.9465277777777777 | 0 |
| 0.9472222222222223 | 0 |
| 0.9479166666666666 | 0 |
| 0.9486111111111111 | 0 |
| 0.9493055555555556 | 0 |
| 0.9500000000000001 | 0 |
| 0.9506944444444444 | 0 |
| 0.9513888888888888 | 0 |
| 0.9520833333333334 | 0 |
| 0.9527777777777778 | 0 |
| 0.9534722222222222 | 0 |
| 0.9541666666666666 | 0 |
| 0.9548611111111112 | 0 |
| 0.9555555555555556 | 0 |
| 0.9562499999999999 | 0 |
| 0.9569444444444444 | 0 |
| 0.9576388888888889 | 0 |
| 0.9583333333333334 | 0 |
| 0.9590277777777777 | 0 |
| 0.9597222222222223 | 0 |
| 0.9604166666666667 | 0 |
| 0.9611111111111111 | 0 |
| 0.9618055555555555 | 0 |
| 0.9625 | 0 |
| 0.9631944444444445 | 0 |
| 0.9638888888888889 | 0 |
| 0.9645833333333332 | 0 |
| 0.9652777777777778 | 0 |
| 0.9659722222222222 | 0 |
| 0.9666666666666667 | 0 |
| 0.967361111111111 | 0 |
| 0.9680555555555556 | 0 |
| 0.96875 | 0 |
| 0.9694444444444444 | 0 |
| 0.970138888888889 | 0 |
| 0.9708333333333333 | 0 |
| 0.9715277777777778 | 0 |
| 0.9722222222222222 | 0 |
| 0.9729166666666668 | 0 |
| 0.9736111111111111 | 0 |
| 0.9743055555555555 | 0 |
| 0.975 | 0 |
| 0.9756944444444445 | 0 |
| 0.9763888888888889 | 0 |
| 0.9770833333333333 | 0 |
| 0.9777777777777777 | 0 |
| 0.9784722222222223 | 0 |
| 0.9791666666666666 | 0 |
| 0.9798611111111111 | 0 |
| 0.9805555555555556 | 0 |
| 0.9812500000000001 | 0 |
| 0.9819444444444444 | 0 |
| 0.9826388888888888 | 0 |
| 0.9833333333333334 | 0 |
| 0.9840277777777778 | 0 |
| 0.9847222222222222 | 0 |
| 0.9854166666666666 | 0 |
| 0.9861111111111112 | 0 |
| 0.9868055555555556 | 0 |
| 0.9874999999999999 | 0 |
| 0.9881944444444444 | 0 |
| 0.9888888888888889 | 0 |
| 0.9895833333333334 | 0 |
| 0.9902777777777777 | 0 |
| 0.9909722222222223 | 0 |
| 0.9916666666666667 | 0 |
| 0.9923611111111111 | 0 |
| 0.9930555555555555 | 0 |
| 0.99375 | 0 |
| 0.9944444444444445 | 0 |
| 0.9951388888888889 | 0 |
| 0.9958333333333332 | 0 |
| 0.9965277777777778 | 0 |
| 0.9972222222222222 | 0 |
| 0.9979166666666667 | 0 |
| 0.998611111111111 | 0 |
| 0.9993055555555556 | 0 |